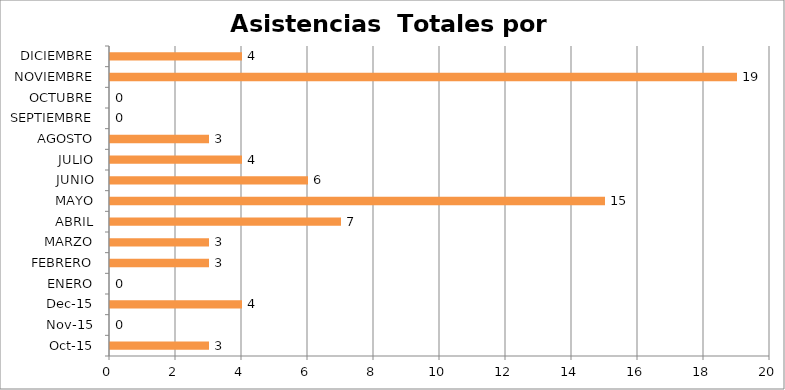
| Category | Series 0 |
|---|---|
| oct-15 | 3 |
| nov-15 | 0 |
| dic-15 | 4 |
| ENERO | 0 |
| FEBRERO | 3 |
| MARZO | 3 |
| ABRIL | 7 |
| MAYO | 15 |
| JUNIO | 6 |
| JULIO | 4 |
| AGOSTO | 3 |
| SEPTIEMBRE | 0 |
| OCTUBRE | 0 |
| NOVIEMBRE | 19 |
| DICIEMBRE | 4 |